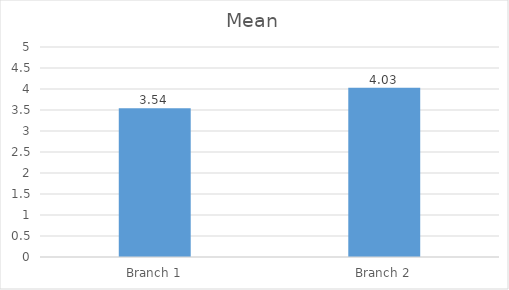
| Category | Mean |
|---|---|
| Branch 1 | 3.54 |
| Branch 2 | 4.03 |